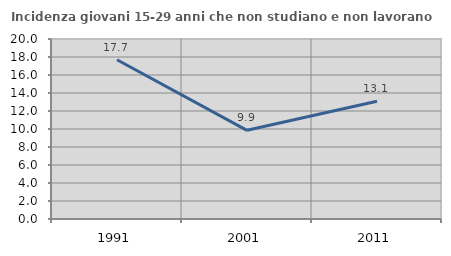
| Category | Incidenza giovani 15-29 anni che non studiano e non lavorano  |
|---|---|
| 1991.0 | 17.694 |
| 2001.0 | 9.852 |
| 2011.0 | 13.08 |